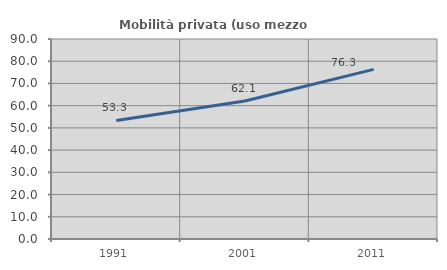
| Category | Mobilità privata (uso mezzo privato) |
|---|---|
| 1991.0 | 53.333 |
| 2001.0 | 62.092 |
| 2011.0 | 76.344 |